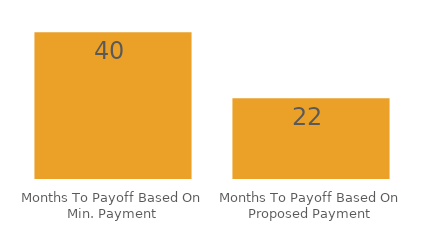
| Category | Series 0 |
|---|---|
| Months To Payoff Based On Min. Payment | 40 |
| Months To Payoff Based On Proposed Payment | 22 |